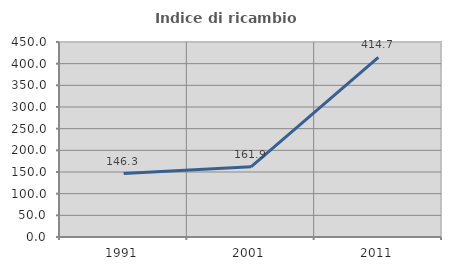
| Category | Indice di ricambio occupazionale  |
|---|---|
| 1991.0 | 146.296 |
| 2001.0 | 161.905 |
| 2011.0 | 414.706 |